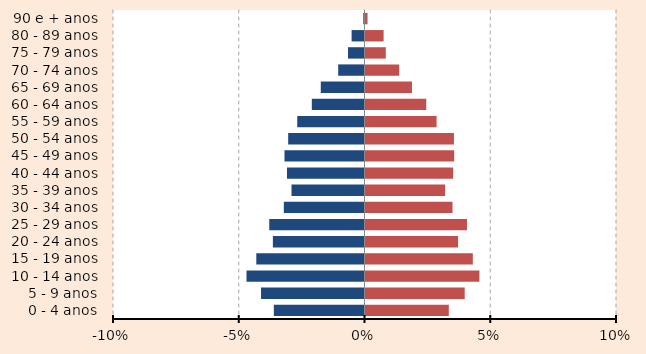
| Category | Series 0 | Homens (%) | Mulheres (%) |
|---|---|---|---|
| 0 - 4 anos |  | -3.605 | 3.352 |
| 5 - 9 anos |  | -4.114 | 3.985 |
| 10 - 14 anos |  | -4.692 | 4.569 |
| 15 - 19 anos |  | -4.302 | 4.307 |
| 20 - 24 anos |  | -3.643 | 3.72 |
| 25 - 29 anos |  | -3.787 | 4.076 |
| 30 - 34 anos |  | -3.208 | 3.499 |
| 35 - 39 anos |  | -2.902 | 3.205 |
| 40 - 44 anos |  | -3.083 | 3.525 |
| 45 - 49 anos |  | -3.181 | 3.566 |
| 50 - 54 anos |  | -3.035 | 3.557 |
| 55 - 59 anos |  | -2.674 | 2.866 |
| 60 - 64 anos |  | -2.095 | 2.455 |
| 65 - 69 anos |  | -1.739 | 1.888 |
| 70 - 74 anos |  | -1.046 | 1.38 |
| 75 - 79 anos |  | -0.656 | 0.846 |
| 80 - 89 anos |  | -0.512 | 0.76 |
| 90 e + anos |  | -0.048 | 0.12 |